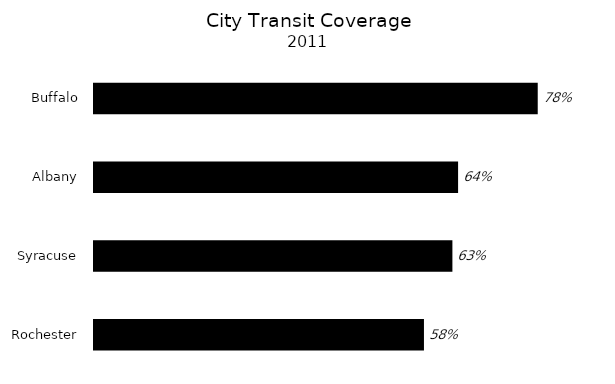
| Category | Transit Coverage |
|---|---|
| Rochester | 0.58 |
| Syracuse | 0.63 |
| Albany | 0.64 |
| Buffalo | 0.78 |